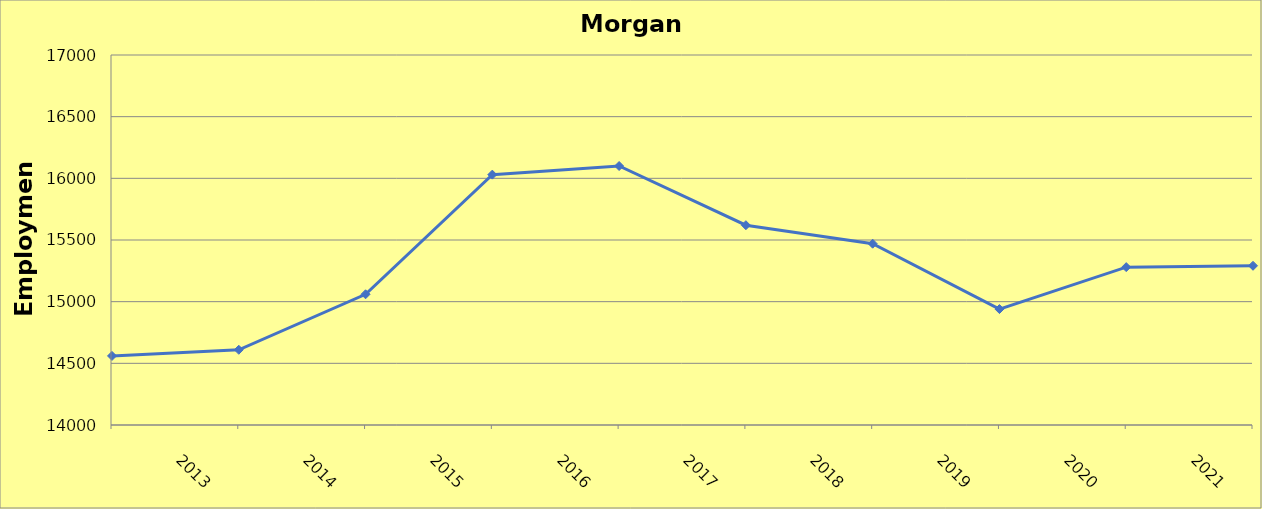
| Category | Morgan County |
|---|---|
| 2013.0 | 14560 |
| 2014.0 | 14610 |
| 2015.0 | 15060 |
| 2016.0 | 16030 |
| 2017.0 | 16100 |
| 2018.0 | 15620 |
| 2019.0 | 15470 |
| 2020.0 | 14940 |
| 2021.0 | 15280 |
| 2022.0 | 15291 |